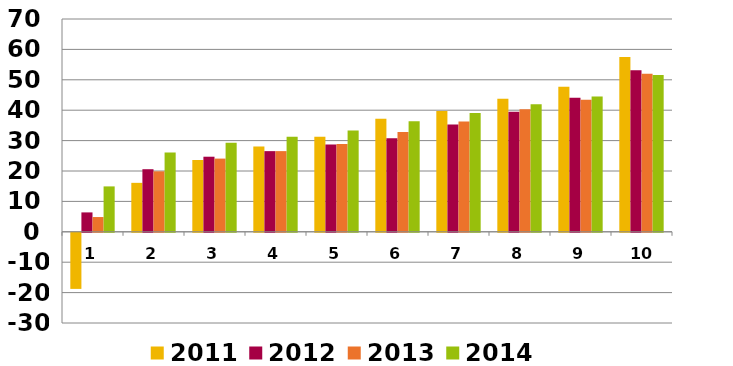
| Category | 2011 | 2012 | 2013 | 2014 |
|---|---|---|---|---|
| 1.0 | -18.452 | 6.381 | 4.854 | 14.934 |
| 2.0 | 16.105 | 20.587 | 19.893 | 26.088 |
| 3.0 | 23.628 | 24.699 | 24.083 | 29.26 |
| 4.0 | 28.041 | 26.535 | 26.541 | 31.268 |
| 5.0 | 31.281 | 28.735 | 28.888 | 33.346 |
| 6.0 | 37.187 | 30.767 | 32.861 | 36.324 |
| 7.0 | 39.733 | 35.28 | 36.244 | 39.054 |
| 8.0 | 43.805 | 39.458 | 40.317 | 41.937 |
| 9.0 | 47.742 | 44.103 | 43.458 | 44.537 |
| 10.0 | 57.487 | 53.128 | 51.966 | 51.542 |